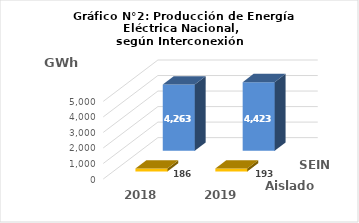
| Category | Aislados | SEIN |
|---|---|---|
| 2018.0 | 185.854 | 4262.86 |
| 2019.0 | 193.43 | 4422.595 |